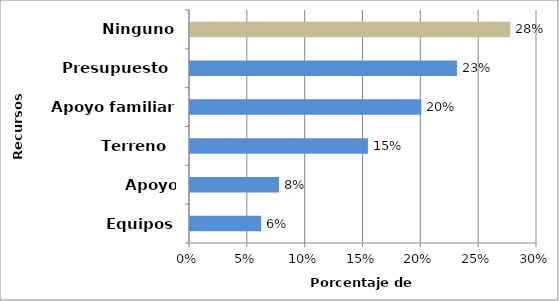
| Category | Series 0 |
|---|---|
| Equipos | 0.062 |
| Apoyo profesional  | 0.077 |
| Terreno  | 0.154 |
| Apoyo familiar | 0.2 |
| Presupuesto  | 0.231 |
| Ninguno | 0.277 |